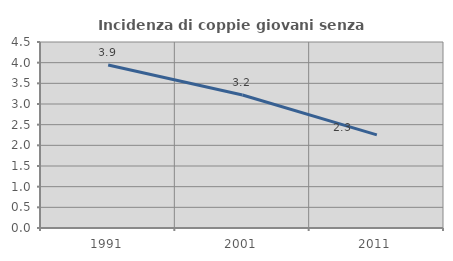
| Category | Incidenza di coppie giovani senza figli |
|---|---|
| 1991.0 | 3.944 |
| 2001.0 | 3.217 |
| 2011.0 | 2.254 |